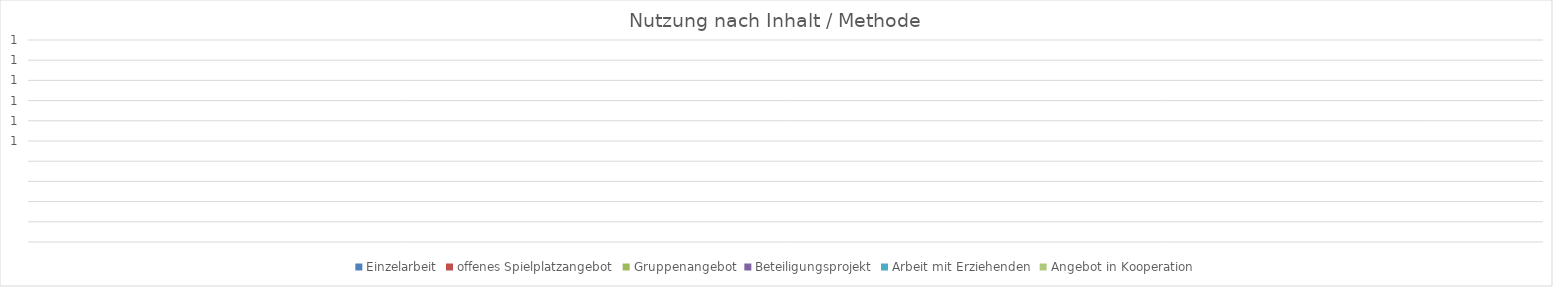
| Category | Einzelarbeit | offenes Spielplatzangebot | Gruppenangebot | Beteiligungsprojekt | Arbeit mit Erziehenden | Angebot in Kooperation |
|---|---|---|---|---|---|---|
| 0 | 0 | 0 | 0 | 0 | 0 | 0 |